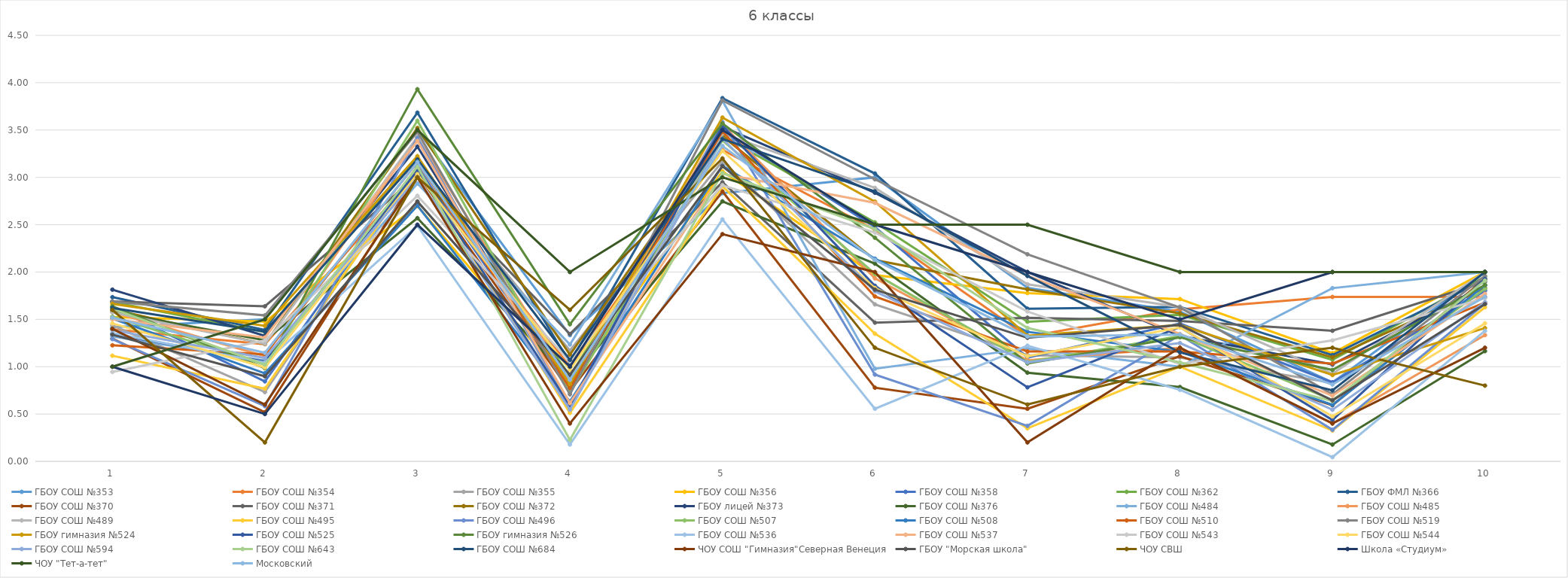
| Category | ГБОУ СОШ №353 | ГБОУ СОШ №354 | ГБОУ СОШ №355 | ГБОУ СОШ №356 | ГБОУ СОШ №358  | ГБОУ СОШ №362 | ГБОУ ФМЛ №366 | ГБОУ СОШ №370 | ГБОУ СОШ №371 | ГБОУ СОШ №372 | ГБОУ лицей №373 | ГБОУ СОШ №376 | ГБОУ СОШ №484 | ГБОУ СОШ №485 | ГБОУ СОШ №489 | ГБОУ СОШ №495 | ГБОУ СОШ №496 | ГБОУ СОШ №507 | ГБОУ СОШ №508 | ГБОУ СОШ №510 | ГБОУ СОШ №519 | ГБОУ гимназия №524 | ГБОУ СОШ №525 | ГБОУ гимназия №526 | ГБОУ СОШ №536 | ГБОУ СОШ №537 | ГБОУ СОШ №543 | ГБОУ СОШ №544 | ГБОУ СОШ №594 | ГБОУ СОШ №643 | ГБОУ СОШ №684 | ЧОУ СОШ "Гимназия"Северная Венеция | ГБОУ "Морская школа" | ЧОУ СВШ | Школа «Студиум» | ЧОУ "Тет-а-тет" | Московский |
|---|---|---|---|---|---|---|---|---|---|---|---|---|---|---|---|---|---|---|---|---|---|---|---|---|---|---|---|---|---|---|---|---|---|---|---|---|---|
| 0 | 1.417 | 1.395 | 1.439 | 1.524 | 1.631 | 1.683 | 1.735 | 1.296 | 1.69 | 1.606 | 1.814 | 1.582 | 1.319 | 1.578 | 1.574 | 1.116 | 1.292 | 1.529 | 1.509 | 1.226 | 1.688 | 1.664 | 1.345 | 1.638 | 1.356 | 1.5 | 0.944 | 1.458 | 1.386 | 1.614 | 1.621 | 1.4 | 1.339 | 1.6 | 1 | 1 | 1.517 |
| 1 | 1.5 | 1.237 | 0.732 | 1.476 | 0.845 | 1.366 | 1.388 | 0.519 | 1.638 | 1.239 | 1.326 | 1.278 | 1.064 | 1.111 | 1.241 | 0.767 | 0.583 | 1.02 | 0.93 | 1.129 | 1.542 | 1.432 | 1.055 | 0.983 | 1.044 | 1.308 | 1.278 | 0.992 | 1.091 | 1.023 | 1.37 | 0.6 | 0.898 | 0.2 | 0.5 | 1.5 | 1.147 |
| 2 | 3.5 | 3.053 | 3.122 | 2.698 | 3.107 | 3.207 | 3.684 | 3.037 | 3.017 | 3.521 | 3.326 | 2.57 | 2.936 | 3.422 | 3.426 | 3.093 | 3.417 | 3.598 | 2.702 | 3.161 | 3.479 | 3.224 | 3.073 | 3.931 | 2.489 | 3.385 | 2.806 | 3.034 | 3 | 3.114 | 3.189 | 3 | 2.746 | 3 | 2.5 | 3.5 | 3.162 |
| 3 | 1.333 | 1 | 1.171 | 0.794 | 0.777 | 0.902 | 1.041 | 0.741 | 1.345 | 1.127 | 0.744 | 0.861 | 1.234 | 0.844 | 0.556 | 0.512 | 0.583 | 0.725 | 0.632 | 0.774 | 0.708 | 0.816 | 0.582 | 1.448 | 0.178 | 0.615 | 1.056 | 0.966 | 0.545 | 0.227 | 1.071 | 0.4 | 0.915 | 1.6 | 1 | 2 | 0.862 |
| 4 | 2.833 | 3.289 | 3.171 | 3.063 | 3.495 | 3.439 | 3.837 | 2.852 | 2.948 | 3.437 | 3.535 | 2.747 | 3.809 | 3.556 | 3.463 | 2.907 | 3.583 | 3.392 | 3.123 | 3.484 | 3.812 | 3.632 | 3.545 | 3.569 | 2.556 | 3.038 | 2.917 | 3.28 | 3.409 | 3.045 | 3.405 | 2.4 | 3.119 | 3.2 | 3.5 | 3 | 3.333 |
| 5 | 3 | 2.447 | 1.659 | 1.968 | 2.476 | 2.524 | 3.041 | 0.778 | 1.466 | 2.127 | 2.837 | 2.089 | 0.979 | 1.933 | 2.889 | 1.349 | 0.917 | 1.98 | 2.14 | 1.742 | 2.979 | 2.744 | 1.855 | 2.362 | 0.556 | 2.731 | 2.417 | 1.831 | 1.795 | 2.455 | 2.852 | 2 | 1.814 | 1.2 | 2.5 | 2.5 | 2.128 |
| 6 | 1.833 | 1.316 | 1.122 | 1.778 | 1.097 | 1.476 | 1.612 | 0.556 | 1.517 | 1.817 | 2 | 0.937 | 1.191 | 1.067 | 1.87 | 0.349 | 0.375 | 1.049 | 1.368 | 1.161 | 2.188 | 1.328 | 0.782 | 1.034 | 1.222 | 1.962 | 1.583 | 1.11 | 1.045 | 1.409 | 1.958 | 0.2 | 1.305 | 0.6 | 2 | 2.5 | 1.319 |
| 7 | 1.583 | 1.605 | 1.098 | 1.714 | 1.456 | 1.549 | 1.633 | 1.111 | 1.483 | 1.563 | 1.326 | 0.785 | 1 | 1.2 | 1.63 | 1 | 1.333 | 1.324 | 1.158 | 1.161 | 1.625 | 1.44 | 1.418 | 1.31 | 0.756 | 1.346 | 1.028 | 1.415 | 1.25 | 1.045 | 1.152 | 1.2 | 1.441 | 1 | 1.5 | 2 | 1.339 |
| 8 | 0.833 | 1.737 | 0.829 | 1.143 | 0.835 | 1.073 | 1.122 | 0.593 | 1.379 | 1.099 | 1.023 | 0.177 | 1.83 | 0.4 | 0.926 | 0.326 | 0.333 | 0.647 | 0.596 | 1.032 | 0.708 | 0.912 | 0.436 | 0.966 | 0.044 | 0.692 | 1.278 | 0.475 | 0.545 | 0.636 | 0.75 | 0.4 | 0.644 | 1.2 | 2 | 2 | 0.812 |
| 9 | 2 | 1.737 | 1.8 | 2 | 1.806 | 1.951 | 1.918 | 1.926 | 1.897 | 1.831 | 1.86 | 1.165 | 2 | 1.333 | 2 | 1.628 | 1.667 | 1.824 | 1.86 | 1.677 | 1.958 | 1.408 | 1.927 | 1.862 | 1.378 | 1.769 | 1.722 | 1.458 | 1.682 | 1.909 | 2 | 1.2 | 1.661 | 0.8 | 2 | 2 | 1.738 |